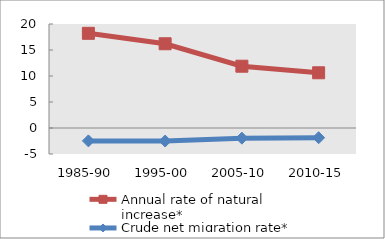
| Category | Annual rate of natural increase* | Crude net migration rate* |
|---|---|---|
| 1985-90 | 18.208 | -2.476 |
| 1995-00 | 16.199 | -2.507 |
| 2005-10 | 11.883 | -1.951 |
| 2010-15 | 10.619 | -1.863 |